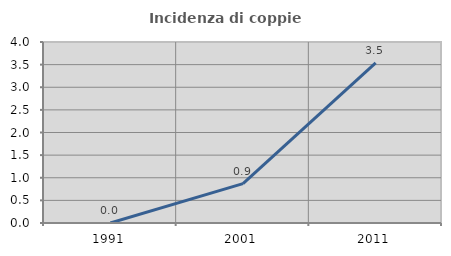
| Category | Incidenza di coppie miste |
|---|---|
| 1991.0 | 0 |
| 2001.0 | 0.87 |
| 2011.0 | 3.54 |